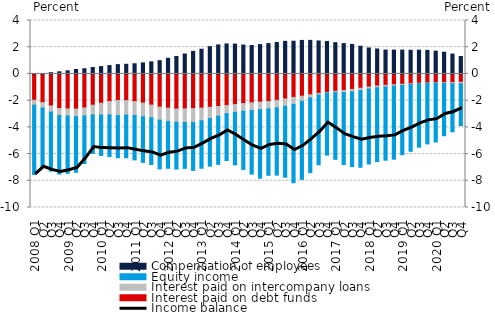
| Category | Interest paid on debt funds | Interest paid on intercompany loans | Equity income | Compensation of employees |
|---|---|---|---|---|
| 2008 Q1 | -1.967 | -0.366 | -5.202 | 0.012 |
| Q2 | -2.145 | -0.413 | -4.427 | 0.032 |
| Q3 | -2.396 | -0.458 | -4.421 | 0.095 |
| Q4 | -2.588 | -0.531 | -4.379 | 0.159 |
| 2009 Q1 | -2.615 | -0.533 | -4.292 | 0.232 |
| Q2 | -2.635 | -0.565 | -4.169 | 0.331 |
| Q3 | -2.547 | -0.601 | -3.561 | 0.389 |
| Q4 | -2.34 | -0.723 | -2.893 | 0.481 |
| 2010 Q1 | -2.204 | -0.877 | -3.025 | 0.551 |
| Q2 | -2.068 | -1 | -3.117 | 0.625 |
| Q3 | -1.99 | -1.131 | -3.153 | 0.697 |
| Q4 | -1.995 | -1.083 | -3.198 | 0.721 |
| 2011 Q1 | -2.065 | -1.048 | -3.323 | 0.76 |
| Q2 | -2.184 | -1.021 | -3.417 | 0.825 |
| Q3 | -2.33 | -0.955 | -3.498 | 0.903 |
| Q4 | -2.483 | -0.975 | -3.652 | 0.994 |
| 2012 Q1 | -2.569 | -0.99 | -3.504 | 1.169 |
| Q2 | -2.627 | -0.991 | -3.505 | 1.305 |
| Q3 | -2.613 | -1.027 | -3.43 | 1.493 |
| Q4 | -2.596 | -1.044 | -3.58 | 1.69 |
| 2013 Q1 | -2.557 | -0.95 | -3.555 | 1.849 |
| Q2 | -2.495 | -0.841 | -3.568 | 2.038 |
| Q3 | -2.439 | -0.726 | -3.606 | 2.171 |
| Q4 | -2.364 | -0.608 | -3.512 | 2.246 |
| 2014 Q1 | -2.294 | -0.587 | -3.924 | 2.23 |
| Q2 | -2.22 | -0.575 | -4.357 | 2.164 |
| Q3 | -2.162 | -0.571 | -4.767 | 2.124 |
| Q4 | -2.107 | -0.562 | -5.138 | 2.199 |
| 2015 Q1 | -2.055 | -0.565 | -4.969 | 2.272 |
| Q2 | -1.971 | -0.567 | -5.038 | 2.353 |
| Q3 | -1.868 | -0.555 | -5.308 | 2.441 |
| Q4 | -1.758 | -0.517 | -5.871 | 2.448 |
| 2016 Q1 | -1.667 | -0.381 | -5.841 | 2.508 |
| Q2 | -1.559 | -0.235 | -5.594 | 2.513 |
| Q3 | -1.459 | -0.118 | -5.224 | 2.468 |
| Q4 | -1.387 | -0.041 | -4.647 | 2.43 |
| 2017 Q1 | -1.303 | -0.092 | -5.001 | 2.338 |
| Q2 | -1.24 | -0.155 | -5.387 | 2.27 |
| Q3 | -1.162 | -0.177 | -5.597 | 2.206 |
| Q4 | -1.068 | -0.185 | -5.74 | 2.071 |
| 2018 Q1 | -0.979 | -0.157 | -5.605 | 1.942 |
| Q2 | -0.905 | -0.131 | -5.528 | 1.867 |
| Q3 | -0.855 | -0.122 | -5.484 | 1.787 |
| Q4 | -0.807 | -0.111 | -5.467 | 1.783 |
| 2019 Q1 | -0.775 | -0.089 | -5.183 | 1.784 |
| Q2 | -0.731 | -0.059 | -5.002 | 1.77 |
| Q3 | -0.701 | -0.035 | -4.749 | 1.78 |
| Q4 | -0.672 | -0.026 | -4.54 | 1.763 |
| 2020 Q1 | -0.642 | -0.03 | -4.42 | 1.705 |
| Q2 | -0.649 | -0.054 | -3.924 | 1.625 |
| Q3 | -0.642 | -0.093 | -3.596 | 1.485 |
| Q4 | -0.625 | -0.115 | -3.12 | 1.303 |